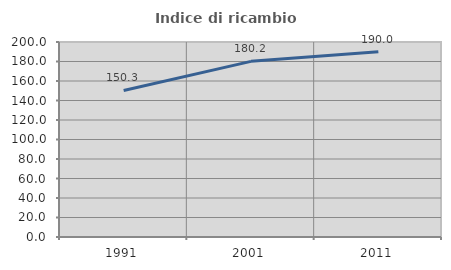
| Category | Indice di ricambio occupazionale  |
|---|---|
| 1991.0 | 150.292 |
| 2001.0 | 180.153 |
| 2011.0 | 190 |